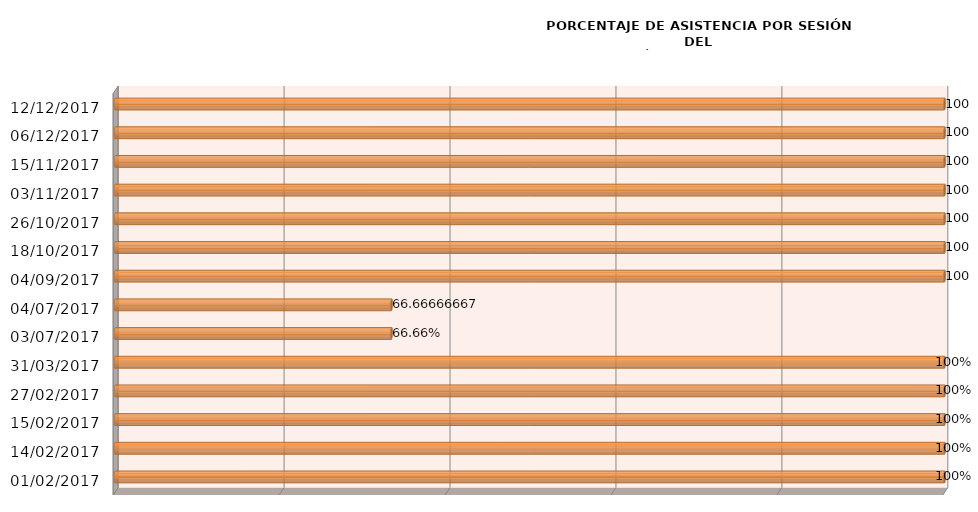
| Category | Series 0 |
|---|---|
| 01/02/2017 | 100 |
| 14/02/2017 | 100 |
| 15/02/2017 | 100 |
| 27/02/2017 | 100 |
| 31/03/2017 | 100 |
| 03/07/2017 | 66.667 |
| 04/07/2017 | 66.667 |
| 04/09/2017 | 100 |
| 18/10/2017 | 100 |
| 26/10/2017 | 100 |
| 03/11/2017 | 100 |
| 15/11/2017 | 100 |
| 06/12/2017 | 100 |
| 12/12/2017 | 100 |